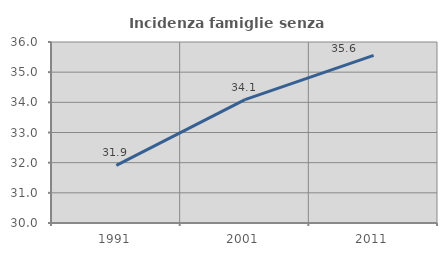
| Category | Incidenza famiglie senza nuclei |
|---|---|
| 1991.0 | 31.913 |
| 2001.0 | 34.089 |
| 2011.0 | 35.557 |